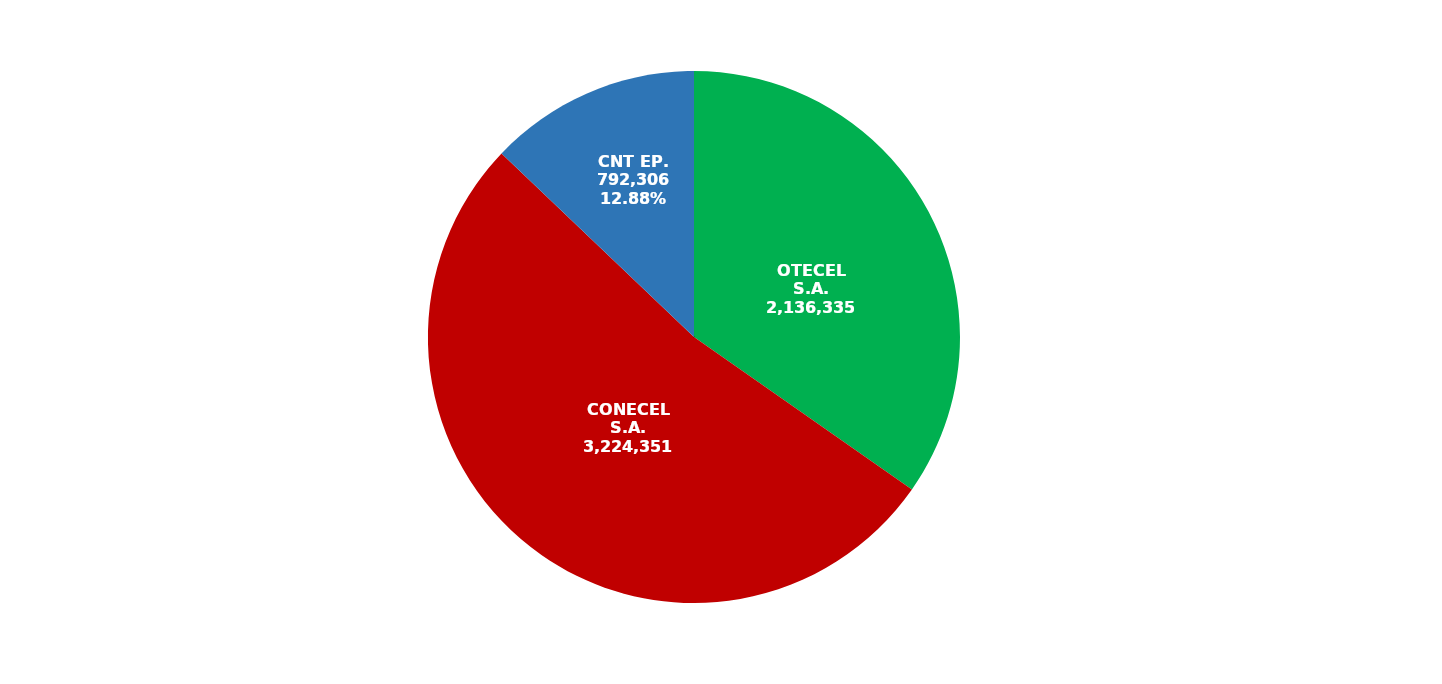
| Category | Series 0 |
|---|---|
| OTECEL S.A. | 2136335 |
| CONECEL S.A. | 3224351 |
| CNT EP. | 792306 |